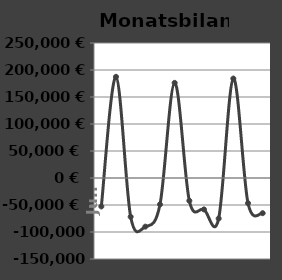
| Category | Monatsbilanz |
|---|---|
| 2019-07-01 | -52711 |
| 2019-08-01 | 187345 |
| 2019-09-01 | -71836 |
| 2019-10-01 | -90091 |
| 2019-11-01 | -48911 |
| 2019-12-01 | 176189 |
| 2020-01-01 | -42211 |
| 2020-02-01 | -58211 |
| 2020-03-01 | -75086 |
| 2020-04-01 | 184189 |
| 2020-05-01 | -46591 |
| 2020-06-01 | -65166 |